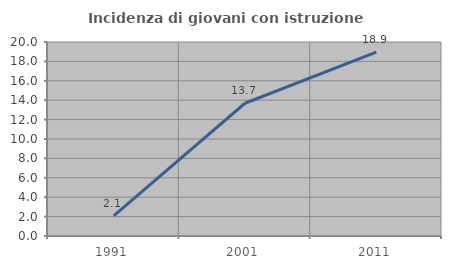
| Category | Incidenza di giovani con istruzione universitaria |
|---|---|
| 1991.0 | 2.083 |
| 2001.0 | 13.684 |
| 2011.0 | 18.947 |